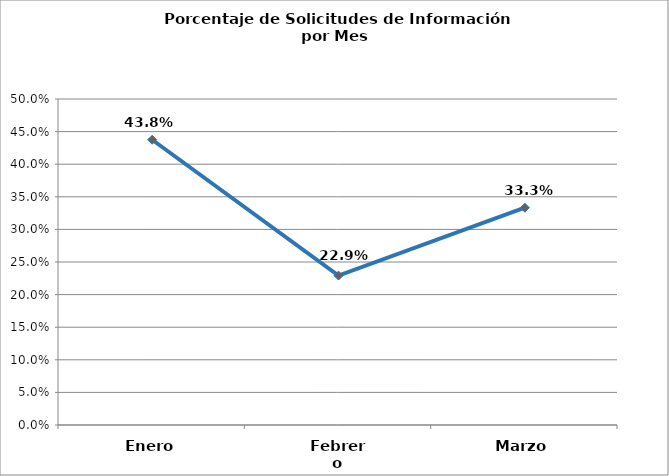
| Category | Series 0 |
|---|---|
| Enero | 0.438 |
| Febrero | 0.229 |
| Marzo | 0.333 |